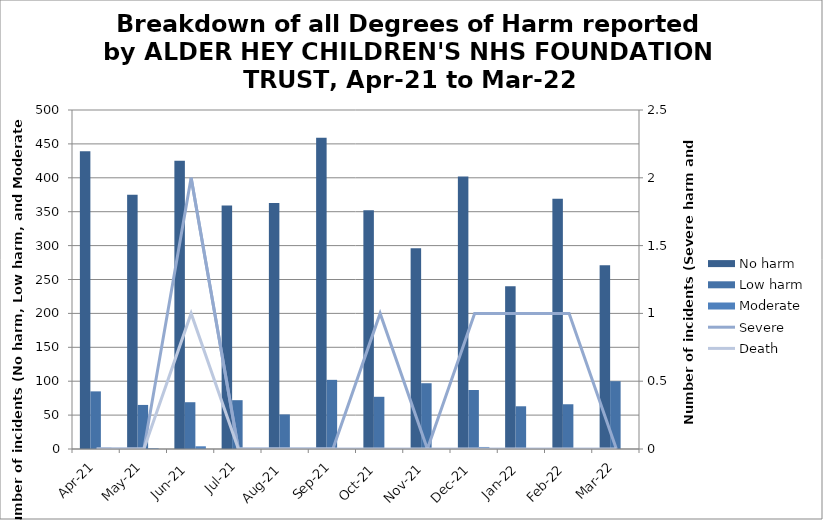
| Category | No harm | Low harm | Moderate |
|---|---|---|---|
| Apr-21 | 439 | 85 | 2 |
| May-21 | 375 | 65 | 1 |
| Jun-21 | 425 | 69 | 4 |
| Jul-21 | 359 | 72 | 0 |
| Aug-21 | 363 | 51 | 1 |
| Sep-21 | 459 | 102 | 1 |
| Oct-21 | 352 | 77 | 0 |
| Nov-21 | 296 | 97 | 0 |
| Dec-21 | 402 | 87 | 3 |
| Jan-22 | 240 | 63 | 1 |
| Feb-22 | 369 | 66 | 1 |
| Mar-22 | 271 | 100 | 0 |